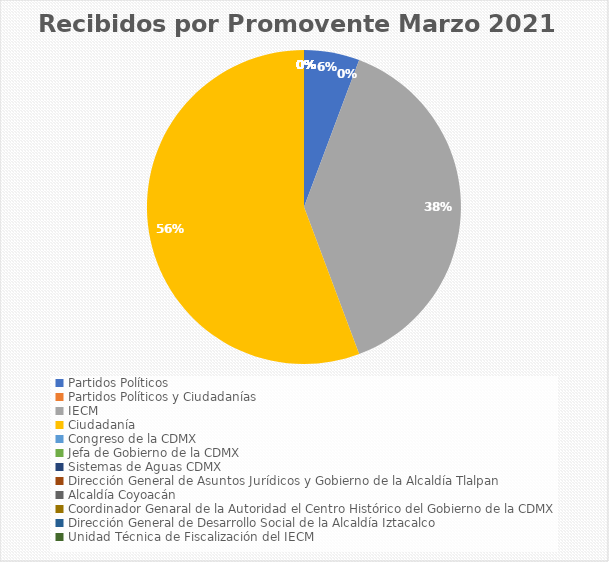
| Category | Recibidos por Promovente Marzo |
|---|---|
| Partidos Políticos | 4 |
| Partidos Políticos y Ciudadanías | 0 |
| IECM | 27 |
| Ciudadanía  | 39 |
| Congreso de la CDMX | 0 |
| Jefa de Gobierno de la CDMX | 0 |
| Sistemas de Aguas CDMX | 0 |
| Dirección General de Asuntos Jurídicos y Gobierno de la Alcaldía Tlalpan | 0 |
| Alcaldía Coyoacán | 0 |
| Coordinador Genaral de la Autoridad el Centro Histórico del Gobierno de la CDMX | 0 |
| Dirección General de Desarrollo Social de la Alcaldía Iztacalco | 0 |
| Unidad Técnica de Fiscalización del IECM | 0 |